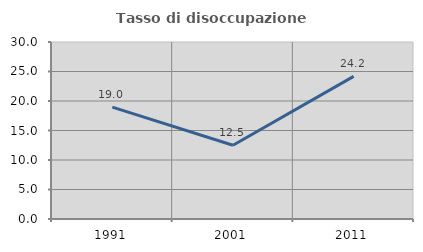
| Category | Tasso di disoccupazione giovanile  |
|---|---|
| 1991.0 | 18.966 |
| 2001.0 | 12.5 |
| 2011.0 | 24.176 |